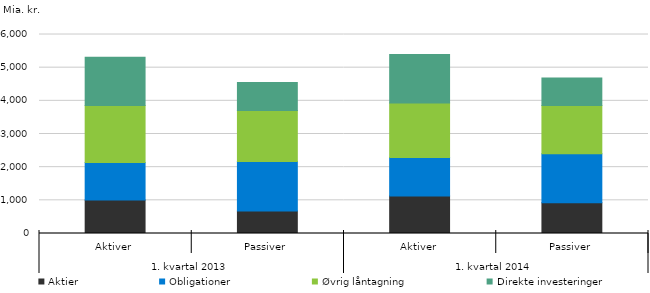
| Category | Aktier | Obligationer | Øvrig låntagning | Direkte investeringer |
|---|---|---|---|---|
| 0 | 1011 | 1131 | 1720 | 1451 |
| 1 | 675 | 1499 | 1535 | 841 |
| 2 | 1129 | 1159 | 1649 | 1459 |
| 3 | 924 | 1483 | 1450 | 835 |